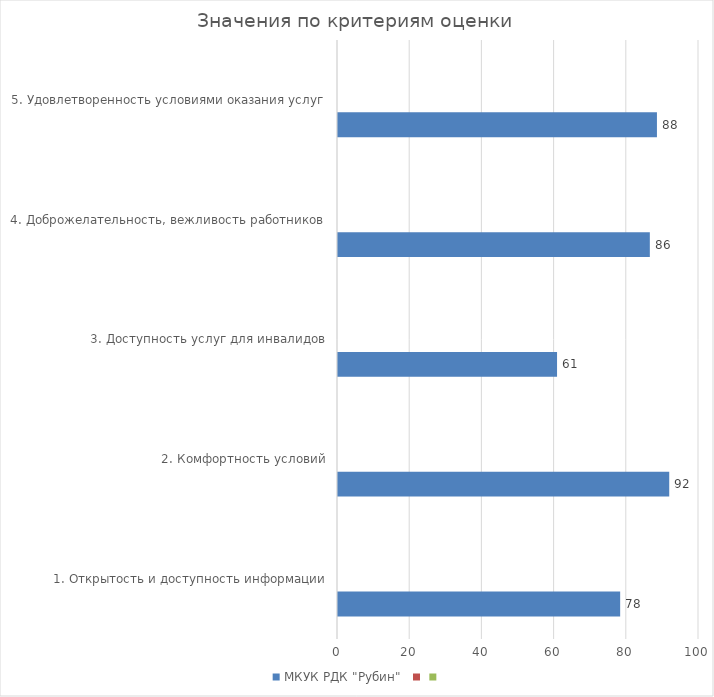
| Category | МКУК РДК "Рубин"  | Series 1 | Series 2 |
|---|---|---|---|
| 1. Открытость и доступность информации | 78.163 |  |  |
| 2. Комфортность условий | 91.756 |  |  |
| 3. Доступность услуг для инвалидов | 60.677 |  |  |
| 4. Доброжелательность, вежливость работников | 86.382 |  |  |
| 5. Удовлетворенность условиями оказания услуг | 88.351 |  |  |